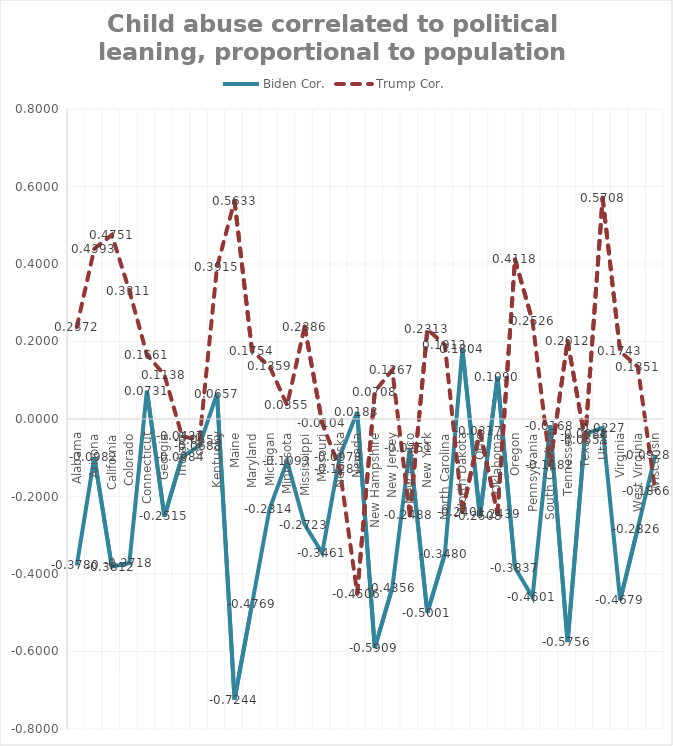
| Category | Abused | Population | Proportion | Republican/lean Rep. | No lean | Democrat/lean Dem. | Sample size | Biden Cor. | Trump Cor. |
|---|---|---|---|---|---|---|---|---|---|
| Alabama |  |  |  |  |  |  |  | -0.378 | 0.237 |
| Arizona |  |  |  |  |  |  |  | -0.098 | 0.439 |
| California |  |  |  |  |  |  |  | -0.381 | 0.475 |
| Colorado |  |  |  |  |  |  |  | -0.372 | 0.331 |
| Connecticut |  |  |  |  |  |  |  | 0.073 | 0.166 |
| Georgia |  |  |  |  |  |  |  | -0.251 | 0.114 |
| Indiana |  |  |  |  |  |  |  | -0.098 | -0.044 |
| Iowa |  |  |  |  |  |  |  | -0.069 | -0.055 |
| Kentucky |  |  |  |  |  |  |  | 0.066 | 0.392 |
| Maine |  |  |  |  |  |  |  | -0.724 | 0.563 |
| Maryland |  |  |  |  |  |  |  | -0.477 | 0.175 |
| Michigan |  |  |  |  |  |  |  | -0.231 | 0.136 |
| Minnesota |  |  |  |  |  |  |  | -0.109 | 0.036 |
| Mississippi |  |  |  |  |  |  |  | -0.272 | 0.239 |
| Missouri |  |  |  |  |  |  |  | -0.346 | -0.01 |
| Nebraska |  |  |  |  |  |  |  | -0.098 | -0.128 |
| Nevada |  |  |  |  |  |  |  | 0.018 | -0.451 |
| New Hampshire |  |  |  |  |  |  |  | -0.591 | 0.071 |
| New Jersey |  |  |  |  |  |  |  | -0.436 | 0.127 |
| New Mexico |  |  |  |  |  |  |  | -0.075 | -0.249 |
| New York |  |  |  |  |  |  |  | -0.5 | 0.231 |
| North Carolina |  |  |  |  |  |  |  | -0.348 | 0.191 |
| North Dakota |  |  |  |  |  |  |  | 0.18 | -0.24 |
| Ohio |  |  |  |  |  |  |  | -0.251 | -0.032 |
| Oklahoma |  |  |  |  |  |  |  | 0.109 | -0.244 |
| Oregon |  |  |  |  |  |  |  | -0.384 | 0.412 |
| Pennsylvania |  |  |  |  |  |  |  | -0.46 | 0.253 |
| South Carolina |  |  |  |  |  |  |  | -0.017 | -0.118 |
| Tennessee |  |  |  |  |  |  |  | -0.576 | 0.201 |
| Texas |  |  |  |  |  |  |  | -0.039 | -0.055 |
| Utah |  |  |  |  |  |  |  | -0.023 | 0.571 |
| Virginia |  |  |  |  |  |  |  | -0.468 | 0.174 |
| West Virginia |  |  |  |  |  |  |  | -0.283 | 0.135 |
| Wisconsin |  |  |  |  |  |  |  | -0.093 | -0.187 |